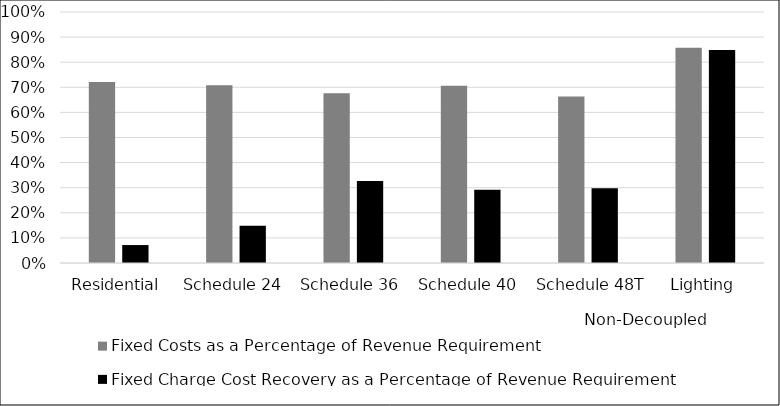
| Category |  Fixed Costs as a Percentage of Revenue Requirement  |  Fixed Charge Cost Recovery as a Percentage of Revenue Requirement Recovery  |
|---|---|---|
|  Residential  | 0.721 | 0.071 |
|  Schedule 24  | 0.708 | 0.149 |
|  Schedule 36  | 0.676 | 0.326 |
|  Schedule 40  | 0.706 | 0.292 |
|  Schedule 48T  | 0.664 | 0.298 |
|  Lighting  | 0.858 | 0.848 |